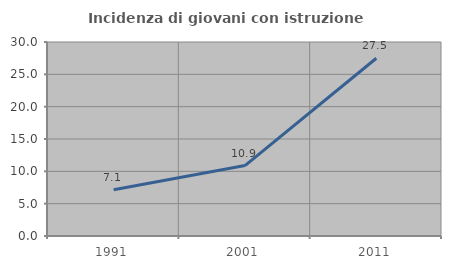
| Category | Incidenza di giovani con istruzione universitaria |
|---|---|
| 1991.0 | 7.143 |
| 2001.0 | 10.891 |
| 2011.0 | 27.49 |